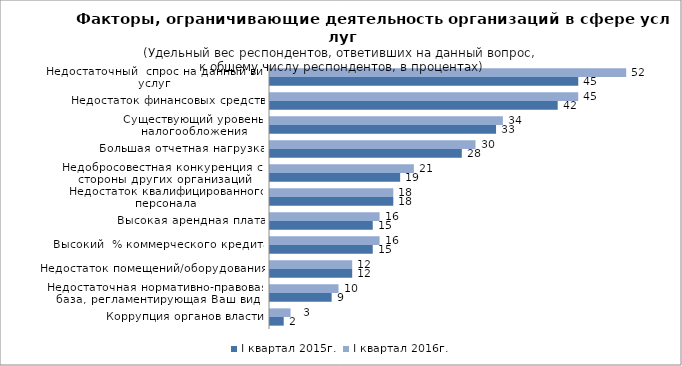
| Category | I квартал 2015г. | I квартал 2016г. |
|---|---|---|
| Коррупция органов власти | 2 | 3 |
| Недостаточная нормативно-правовая база, регламентирующая Ваш вид деятельности | 9 | 10 |
| Недостаток помещений/оборудования | 12 | 12 |
| Высокий  % коммерческого кредита | 15 | 16 |
| Высокая арендная плата | 15 | 16 |
| Недостаток квалифицированного персонала | 18 | 18 |
| Недобросовестная конкуренция со стороны других организаций | 19 | 21 |
| Большая отчетная нагрузка | 28 | 30 |
| Существующий уровень налогообложения | 33 | 34 |
| Недостаток финансовых средств | 42 | 45 |
| Недостаточный  спрос на данный вид услуг | 45 | 52 |